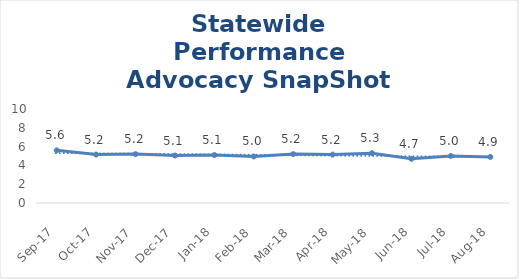
| Category | Statewide |
|---|---|
| Sep-17 | 5.6 |
| Oct-17 | 5.15 |
| Nov-17 | 5.2 |
| Dec-17 | 5.05 |
| Jan-18 | 5.1 |
| Feb-18 | 4.95 |
| Mar-18 | 5.2 |
| Apr-18 | 5.15 |
| May-18 | 5.3 |
| Jun-18 | 4.7 |
| Jul-18 | 5 |
| Aug-18 | 4.9 |